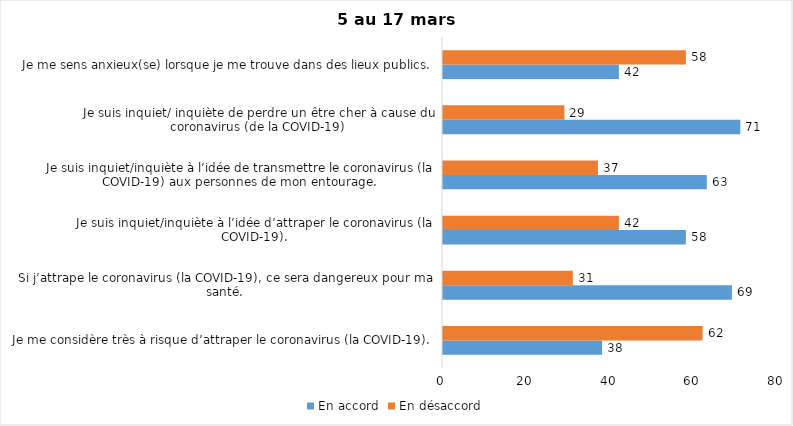
| Category | En accord | En désaccord |
|---|---|---|
| Je me considère très à risque d’attraper le coronavirus (la COVID-19). | 38 | 62 |
| Si j’attrape le coronavirus (la COVID-19), ce sera dangereux pour ma santé. | 69 | 31 |
| Je suis inquiet/inquiète à l’idée d’attraper le coronavirus (la COVID-19). | 58 | 42 |
| Je suis inquiet/inquiète à l’idée de transmettre le coronavirus (la COVID-19) aux personnes de mon entourage. | 63 | 37 |
| Je suis inquiet/ inquiète de perdre un être cher à cause du coronavirus (de la COVID-19) | 71 | 29 |
| Je me sens anxieux(se) lorsque je me trouve dans des lieux publics. | 42 | 58 |